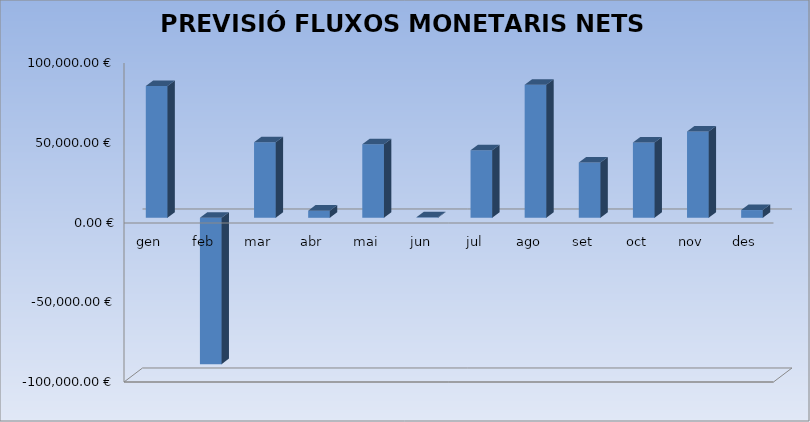
| Category | 82.622,02 € |
|---|---|
| gen | 82622.02 |
| feb | -91775.48 |
| mar | 47349.28 |
| abr | 4456.42 |
| mai | 46110.53 |
| jun | 279.25 |
| jul | 42327.49 |
| ago | 83384.4 |
| set | 34627.91 |
| oct | 47189.97 |
| nov | 54104.82 |
| des | 4850.39 |